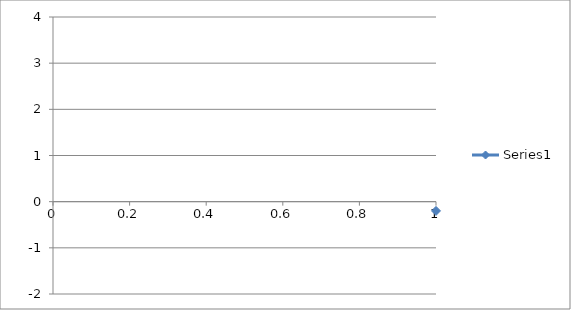
| Category | Series 0 |
|---|---|
| 0 | -0.2 |
| 1 | -0.221 |
| 2 | -0.228 |
| 3 | -0.244 |
| 4 | -0.263 |
| 5 | -0.254 |
| 6 | -0.255 |
| 7 | -0.249 |
| 8 | -0.278 |
| 9 | -0.296 |
| 10 | -0.302 |
| 11 | -0.322 |
| 12 | -0.33 |
| 13 | -0.355 |
| 14 | -0.373 |
| 15 | -0.399 |
| 16 | -0.414 |
| 17 | -0.439 |
| 18 | -0.49 |
| 19 | -0.514 |
| 20 | -0.531 |
| 21 | -0.562 |
| 22 | -0.596 |
| 23 | -0.643 |
| 24 | -0.694 |
| 25 | -0.731 |
| 26 | -0.768 |
| 27 | -0.805 |
| 28 | -0.849 |
| 29 | -0.882 |
| 30 | -0.887 |
| 31 | -0.893 |
| 32 | -0.888 |
| 33 | -0.889 |
| 34 | -0.892 |
| 35 | -0.888 |
| 36 | -0.864 |
| 37 | -0.84 |
| 38 | -0.811 |
| 39 | -0.753 |
| 40 | -0.725 |
| 41 | -0.682 |
| 42 | -0.603 |
| 43 | -0.525 |
| 44 | -0.417 |
| 45 | -0.334 |
| 46 | -0.238 |
| 47 | -0.063 |
| 48 | 0.073 |
| 49 | 0.228 |
| 50 | 0.43 |
| 51 | 0.623 |
| 52 | 0.874 |
| 53 | 1.072 |
| 54 | 1.281 |
| 55 | 1.529 |
| 56 | 1.732 |
| 57 | 1.997 |
| 58 | 2.191 |
| 59 | 2.402 |
| 60 | 2.644 |
| 61 | 2.811 |
| 62 | 2.997 |
| 63 | 3.109 |
| 64 | 3.219 |
| 65 | 3.349 |
| 66 | 3.432 |
| 67 | 3.511 |
| 68 | 3.588 |
| 69 | 3.638 |
| 70 | 3.667 |
| 71 | 3.675 |
| 72 | 3.67 |
| 73 | 3.669 |
| 74 | 3.64 |
| 75 | 3.58 |
| 76 | 3.553 |
| 77 | 3.504 |
| 78 | 3.452 |
| 79 | 3.392 |
| 80 | 3.304 |
| 81 | 3.221 |
| 82 | 3.175 |
| 83 | 3.102 |
| 84 | 3.031 |
| 85 | 2.97 |
| 86 | 2.932 |
| 87 | 2.884 |
| 88 | 2.81 |
| 89 | 2.773 |
| 90 | 2.721 |
| 91 | 2.652 |
| 92 | 2.583 |
| 93 | 2.525 |
| 94 | 2.464 |
| 95 | 2.379 |
| 96 | 2.286 |
| 97 | 2.208 |
| 98 | 2.085 |
| 99 | 1.995 |
| 100 | 1.856 |
| 101 | 1.694 |
| 102 | 1.566 |
| 103 | 1.414 |
| 104 | 1.239 |
| 105 | 1.101 |
| 106 | 0.894 |
| 107 | 0.724 |
| 108 | 0.562 |
| 109 | 0.359 |
| 110 | 0.211 |
| 111 | 0.036 |
| 112 | -0.095 |
| 113 | -0.232 |
| 114 | -0.356 |
| 115 | -0.456 |
| 116 | -0.542 |
| 117 | -0.628 |
| 118 | -0.685 |
| 119 | -0.764 |
| 120 | -0.792 |
| 121 | -0.831 |
| 122 | -0.847 |
| 123 | -0.863 |
| 124 | -0.852 |
| 125 | -0.868 |
| 126 | -0.876 |
| 127 | -0.881 |
| 128 | -0.872 |
| 129 | -0.879 |
| 130 | -0.856 |
| 131 | -0.821 |
| 132 | -0.778 |
| 133 | -0.719 |
| 134 | -0.669 |
| 135 | -0.604 |
| 136 | -0.562 |
| 137 | -0.499 |
| 138 | -0.461 |
| 139 | -0.422 |
| 140 | -0.385 |
| 141 | -0.35 |
| 142 | -0.329 |
| 143 | -0.281 |
| 144 | -0.237 |
| 145 | -0.217 |
| 146 | -0.182 |
| 147 | -0.147 |
| 148 | -0.12 |
| 149 | -0.097 |
| 150 | -0.081 |
| 151 | -0.073 |
| 152 | -0.052 |
| 153 | -0.046 |
| 154 | -0.033 |
| 155 | -0.016 |
| 156 | 0.007 |
| 157 | 0.044 |
| 158 | 0.05 |
| 159 | 0.063 |
| 160 | 0.067 |